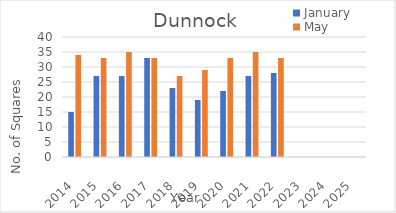
| Category | January | May |
|---|---|---|
| 2014.0 | 15 | 34 |
| 2015.0 | 27 | 33 |
| 2016.0 | 27 | 35 |
| 2017.0 | 33 | 33 |
| 2018.0 | 23 | 27 |
| 2019.0 | 19 | 29 |
| 2020.0 | 22 | 33 |
| 2021.0 | 27 | 35 |
| 2022.0 | 28 | 33 |
| 2023.0 | 0 | 0 |
| 2024.0 | 0 | 0 |
| 2025.0 | 0 | 0 |